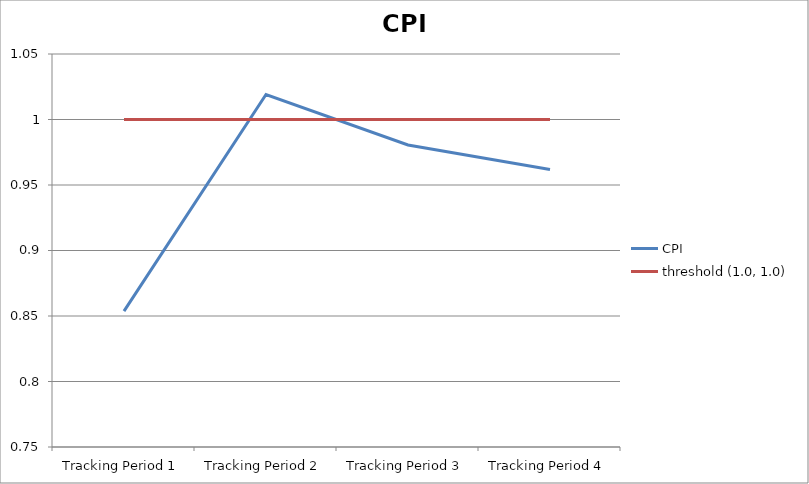
| Category | CPI | threshold (1.0, 1.0) |
|---|---|---|
| Tracking Period 1 | 0.854 | 1 |
| Tracking Period 2 | 1.019 | 1 |
| Tracking Period 3 | 0.981 | 1 |
| Tracking Period 4 | 0.962 | 1 |